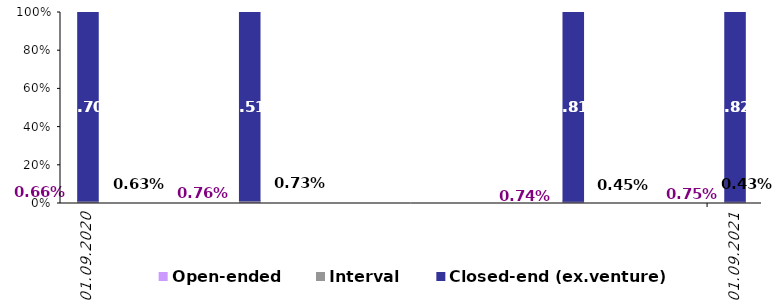
| Category | Open-ended | Interval | Closed-end (ex.venture) |
|---|---|---|---|
| 2020-09-30 | 0.007 | 0.006 | 0.987 |
| 2020-12-31 | 0.008 | 0.007 | 0.985 |
| 2021-06-30 | 0.007 | 0.005 | 0.988 |
| 2021-09-30 | 0.008 | 0.004 | 0.988 |